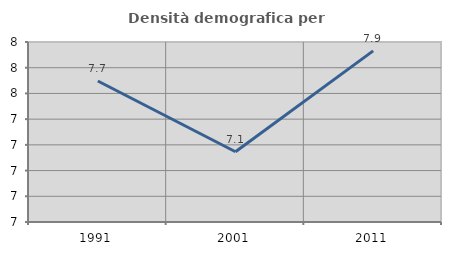
| Category | Densità demografica |
|---|---|
| 1991.0 | 7.697 |
| 2001.0 | 7.146 |
| 2011.0 | 7.931 |